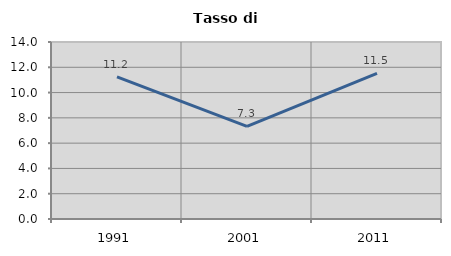
| Category | Tasso di disoccupazione   |
|---|---|
| 1991.0 | 11.236 |
| 2001.0 | 7.333 |
| 2011.0 | 11.524 |